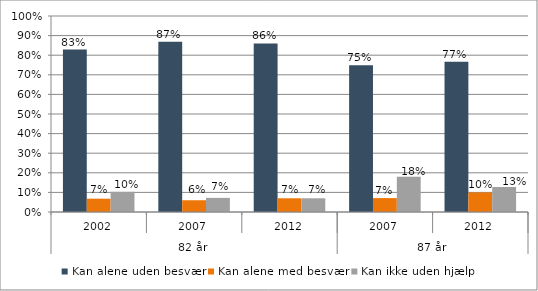
| Category | Kan alene uden besvær | Kan alene med besvær | Kan ikke uden hjælp |
|---|---|---|---|
| 0 | 0.829 | 0.068 | 0.103 |
| 1 | 0.868 | 0.06 | 0.072 |
| 2 | 0.86 | 0.07 | 0.07 |
| 3 | 0.749 | 0.071 | 0.18 |
| 4 | 0.766 | 0.1 | 0.127 |